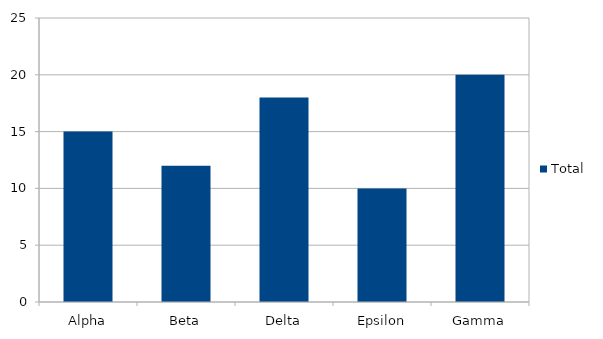
| Category | Total |
|---|---|
| Alpha | 15 |
| Beta | 12 |
| Delta | 18 |
| Epsilon | 10 |
| Gamma | 20 |